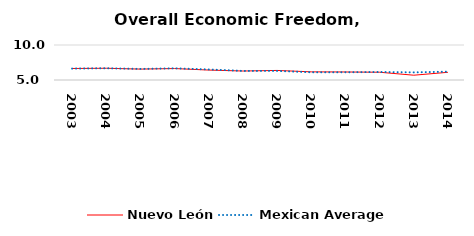
| Category | Nuevo León | Mexican Average  |
|---|---|---|
| 2003.0 | 6.643 | 6.632 |
| 2004.0 | 6.678 | 6.678 |
| 2005.0 | 6.557 | 6.582 |
| 2006.0 | 6.638 | 6.668 |
| 2007.0 | 6.419 | 6.508 |
| 2008.0 | 6.283 | 6.3 |
| 2009.0 | 6.365 | 6.3 |
| 2010.0 | 6.164 | 6.105 |
| 2011.0 | 6.147 | 6.103 |
| 2012.0 | 6.108 | 6.144 |
| 2013.0 | 5.685 | 6.087 |
| 2014.0 | 6.098 | 6.195 |